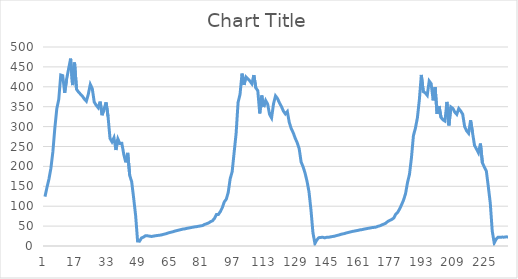
| Category | Series 0 |
|---|---|
| 0 | 124.053 |
| 1 | 146.885 |
| 2 | 168.145 |
| 3 | 195.3 |
| 4 | 236.335 |
| 5 | 295.889 |
| 6 | 345.03 |
| 7 | 368.639 |
| 8 | 429.83 |
| 9 | 428.143 |
| 10 | 384.77 |
| 11 | 419.672 |
| 12 | 445.362 |
| 13 | 470.763 |
| 14 | 404.275 |
| 15 | 460.902 |
| 16 | 393.892 |
| 17 | 386.91 |
| 18 | 381.641 |
| 19 | 376.341 |
| 20 | 369.221 |
| 21 | 363.843 |
| 22 | 381.421 |
| 23 | 405.99 |
| 24 | 395.416 |
| 25 | 361.678 |
| 26 | 353.607 |
| 27 | 347.492 |
| 28 | 362.718 |
| 29 | 328.72 |
| 30 | 344.535 |
| 31 | 360.811 |
| 32 | 325.656 |
| 33 | 270.478 |
| 34 | 261.79 |
| 35 | 272.218 |
| 36 | 241.258 |
| 37 | 268.831 |
| 38 | 257.441 |
| 39 | 257.978 |
| 40 | 230.187 |
| 41 | 210.211 |
| 42 | 233.927 |
| 43 | 177.45 |
| 44 | 161.399 |
| 45 | 120.618 |
| 46 | 76.751 |
| 47 | 12.336 |
| 48 | 12.182 |
| 49 | 20.26 |
| 50 | 22.343 |
| 51 | 25.733 |
| 52 | 25.56 |
| 53 | 24.819 |
| 54 | 23.901 |
| 55 | 24.805 |
| 56 | 25.698 |
| 57 | 26.373 |
| 58 | 27.018 |
| 59 | 27.796 |
| 60 | 29.057 |
| 61 | 30.293 |
| 62 | 31.887 |
| 63 | 33.455 |
| 64 | 34.693 |
| 65 | 35.946 |
| 66 | 37.521 |
| 67 | 38.76 |
| 68 | 40.008 |
| 69 | 41.255 |
| 70 | 42.5 |
| 71 | 43.121 |
| 72 | 44.367 |
| 73 | 45.298 |
| 74 | 46.23 |
| 75 | 47.161 |
| 76 | 48.092 |
| 77 | 48.713 |
| 78 | 49.643 |
| 79 | 50.573 |
| 80 | 51.352 |
| 81 | 54.243 |
| 82 | 55.841 |
| 83 | 57.855 |
| 84 | 60.977 |
| 85 | 63.354 |
| 86 | 69.101 |
| 87 | 79.204 |
| 88 | 79.204 |
| 89 | 86.433 |
| 90 | 96.45 |
| 91 | 110.838 |
| 92 | 117.378 |
| 93 | 134.471 |
| 94 | 169.033 |
| 95 | 186.734 |
| 96 | 235.126 |
| 97 | 282.617 |
| 98 | 360.767 |
| 99 | 381.268 |
| 100 | 433.153 |
| 101 | 404.795 |
| 102 | 424.715 |
| 103 | 419.626 |
| 104 | 414.517 |
| 105 | 407.67 |
| 106 | 429.398 |
| 107 | 397.321 |
| 108 | 390.365 |
| 109 | 333.105 |
| 110 | 378.07 |
| 111 | 349.181 |
| 112 | 365.601 |
| 113 | 356.564 |
| 114 | 330.41 |
| 115 | 321.692 |
| 116 | 357.496 |
| 117 | 377.143 |
| 118 | 370.601 |
| 119 | 359.48 |
| 120 | 350.461 |
| 121 | 338.919 |
| 122 | 331.914 |
| 123 | 337.764 |
| 124 | 310.116 |
| 125 | 294.804 |
| 126 | 284.415 |
| 127 | 270.807 |
| 128 | 259.597 |
| 129 | 244.868 |
| 130 | 210.965 |
| 131 | 199.045 |
| 132 | 183.132 |
| 133 | 162.537 |
| 134 | 135.923 |
| 135 | 90.179 |
| 136 | 33.196 |
| 137 | 6.126 |
| 138 | 15.629 |
| 139 | 20.833 |
| 140 | 21.556 |
| 141 | 21.929 |
| 142 | 20.484 |
| 143 | 21.936 |
| 144 | 21.917 |
| 145 | 23.004 |
| 146 | 23.933 |
| 147 | 24.684 |
| 148 | 26.216 |
| 149 | 27.45 |
| 150 | 29.057 |
| 151 | 30.293 |
| 152 | 31.229 |
| 153 | 32.828 |
| 154 | 34.066 |
| 155 | 35.32 |
| 156 | 36.572 |
| 157 | 37.507 |
| 158 | 38.444 |
| 159 | 39.381 |
| 160 | 40.631 |
| 161 | 41.253 |
| 162 | 42.5 |
| 163 | 43.432 |
| 164 | 44.366 |
| 165 | 45.298 |
| 166 | 46.23 |
| 167 | 46.851 |
| 168 | 47.472 |
| 169 | 49.496 |
| 170 | 50.788 |
| 171 | 53.147 |
| 172 | 55.092 |
| 173 | 57.443 |
| 174 | 61.85 |
| 175 | 64.412 |
| 176 | 66.813 |
| 177 | 70.153 |
| 178 | 79.656 |
| 179 | 84.516 |
| 180 | 93.102 |
| 181 | 103.937 |
| 182 | 115.554 |
| 183 | 131.635 |
| 184 | 159.611 |
| 185 | 180.341 |
| 186 | 222.181 |
| 187 | 277.472 |
| 188 | 295.889 |
| 189 | 321.833 |
| 190 | 367.196 |
| 191 | 429.83 |
| 192 | 387.87 |
| 193 | 384.77 |
| 194 | 378.544 |
| 195 | 414.562 |
| 196 | 407.714 |
| 197 | 365.989 |
| 198 | 399.097 |
| 199 | 331.997 |
| 200 | 351.675 |
| 201 | 322.993 |
| 202 | 316.932 |
| 203 | 313.885 |
| 204 | 362.033 |
| 205 | 303.114 |
| 206 | 349.298 |
| 207 | 345.63 |
| 208 | 336.323 |
| 209 | 330.696 |
| 210 | 345.417 |
| 211 | 339.232 |
| 212 | 330.838 |
| 213 | 299.577 |
| 214 | 289.403 |
| 215 | 283.235 |
| 216 | 315.885 |
| 217 | 284.172 |
| 218 | 252.803 |
| 219 | 243.647 |
| 220 | 234.168 |
| 221 | 257.386 |
| 222 | 208.931 |
| 223 | 198.205 |
| 224 | 188.448 |
| 225 | 149.076 |
| 226 | 107.616 |
| 227 | 37.116 |
| 228 | 7.537 |
| 229 | 17.179 |
| 230 | 22.147 |
| 231 | 21.916 |
| 232 | 22.338 |
| 233 | 22.231 |
| 234 | 22.969 |
| 235 | 22.828 |